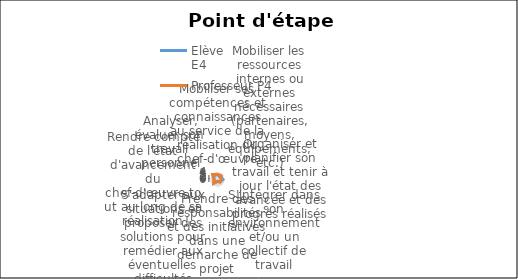
| Category | Elève 
E4 | Professeur P4 |
|---|---|---|
| Mobiliser ses compétences et connaissances au service de la réalisation du chef-d'œuvre | 3 | 3 |
| Mobiliser les ressources internes ou externes nécessaires (partenaires, moyens, équipements, etc.) | 2 | 3 |
| Organiser et planifier son travail et tenir à jour l'état des avancée et des progrès réalisés | 3 | 2 |
| S'intégrer dans son environnement et/ou un collectif de travail | 2 | 2 |
| Prendre des responsabilités et des initiatives dans une démarche de projet | 1 | 1 |
| S'adapter aux situations et proposer des solutions pour remédier aux éventuelles difficultés rencontrées | 3 | 3 |
| Rendre compte de l'état d'avancement du chef-d'œuvre tout au long de sa réalisation | 2 | 2 |
| Analyser, évaluer son travail personnel | 3 | 4 |